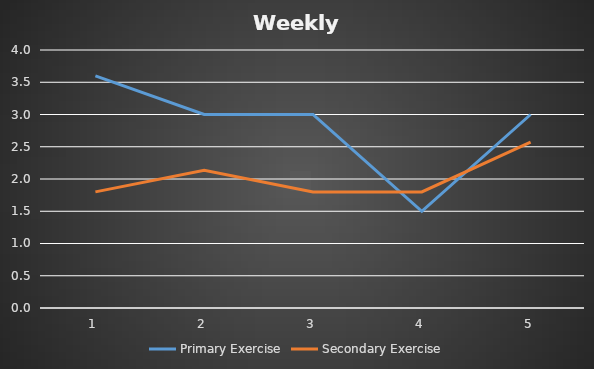
| Category | Primary Exercise | Secondary Exercise |
|---|---|---|
| 0 | 3.6 | 1.8 |
| 1 | 3 | 2.133 |
| 2 | 3 | 1.8 |
| 3 | 1.5 | 1.8 |
| 4 | 3 | 2.571 |